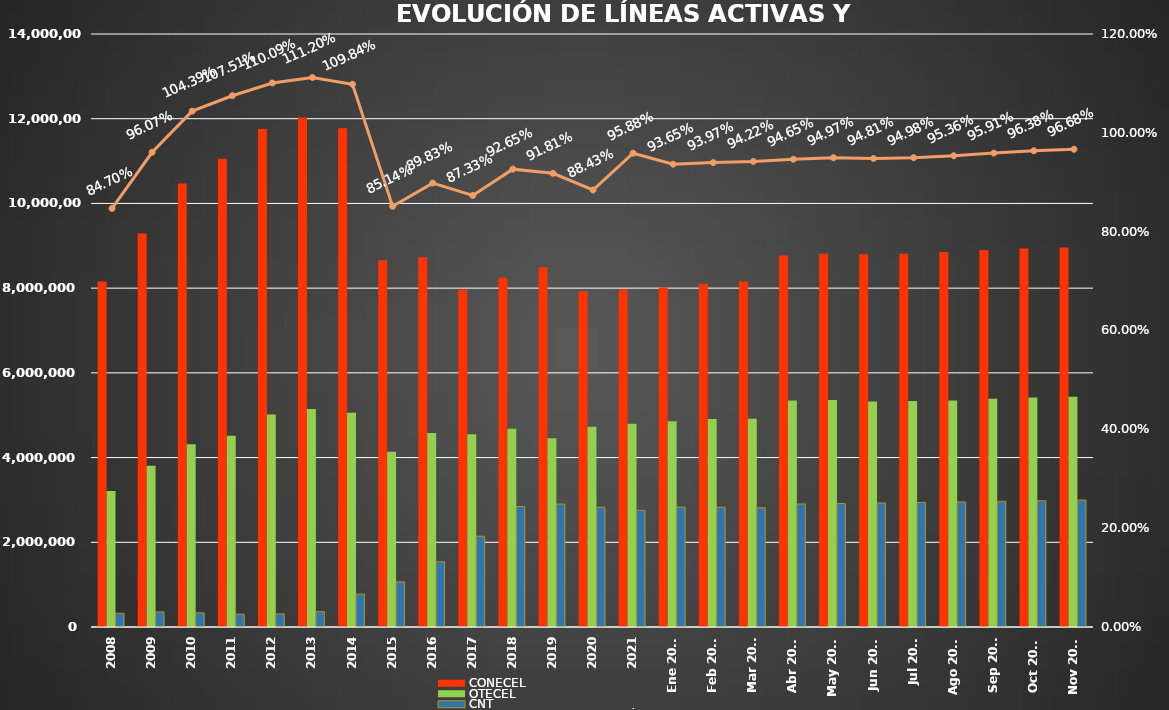
| Category | CONECEL | OTECEL | CNT |
|---|---|---|---|
| 2008 | 8156359 | 3211922 | 323967 |
| 2009 | 9291268 | 3806432 | 356900 |
| 2010 | 10470502 | 4314599 | 333730 |
| 2011 | 11057316 | 4513874 | 303368 |
| 2012 | 11757906 | 5019686 | 309271 |
| 2013 | 12030886 | 5148308 | 362560 |
| 2014 | 11772020 | 5055645 | 776892 |
| 2015 | 8658619 | 4134698 | 1065703 |
| 2016 | 8726823 | 4580092 | 1541219 |
| 2017 | 7960263 | 4549024 | 2142117 |
| 2018 | 8248050 | 4679646 | 2845142 |
| 2019 | 8493054 | 4456356 | 2903690 |
| 2020 | 7929253 | 4729725 | 2826388 |
| 2021 | 7965274 | 4800608 | 2755177 |
| Ene 2022 | 8012894 | 4856877 | 2831764 |
| Feb 2022 | 8103873 | 4909433 | 2827246 |
| Mar 2022 | 8163884 | 4915830 | 2814894 |
| Abr 2022 | 8773356 | 5349789 | 2904652 |
| May 2022 | 8810418 | 5358332 | 2916052 |
| Jun 2022 | 8802391 | 5326606 | 2926942 |
| Jul 2022 | 8811432 | 5334228 | 2940353 |
| Ago 2022 | 8855909 | 5345771 | 2954002 |
| Sep 2022 | 8900276 | 5386355 | 2967003 |
| Oct 2022 | 8938600 | 5418229 | 2980969 |
| Nov 2022 | 8959736 | 5435623 | 2996586 |